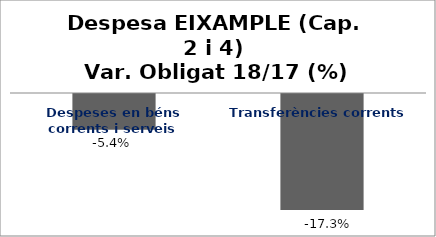
| Category | Series 0 |
|---|---|
| Despeses en béns corrents i serveis | -0.054 |
| Transferències corrents | -0.173 |